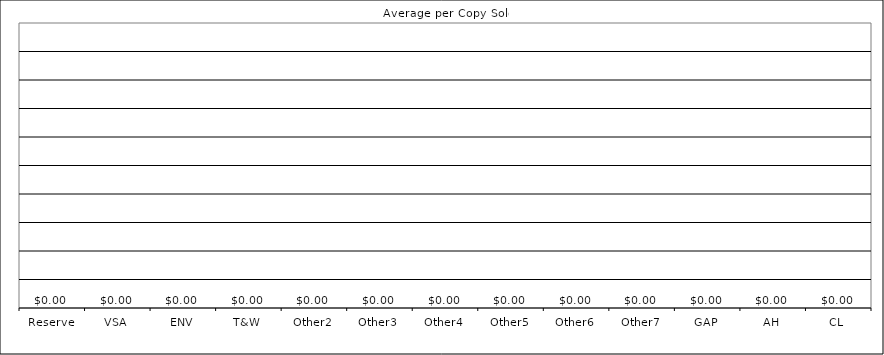
| Category | Averages |
|---|---|
| Reserve | 0 |
| VSA | 0 |
| ENV | 0 |
| T&W | 0 |
| Other2 | 0 |
| Other3 | 0 |
| Other4 | 0 |
| Other5 | 0 |
| Other6 | 0 |
| Other7 | 0 |
| GAP | 0 |
| AH | 0 |
| CL | 0 |